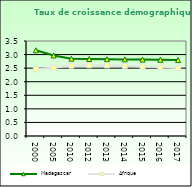
| Category | Madagascar | Afrique                        |
|---|---|---|
| 2000.0 | 3.158 | 2.458 |
| 2005.0 | 2.967 | 2.516 |
| 2010.0 | 2.849 | 2.59 |
| 2012.0 | 2.836 | 2.606 |
| 2013.0 | 2.83 | 2.601 |
| 2014.0 | 2.823 | 2.584 |
| 2015.0 | 2.816 | 2.559 |
| 2016.0 | 2.808 | 2.531 |
| 2017.0 | 2.798 | 2.503 |